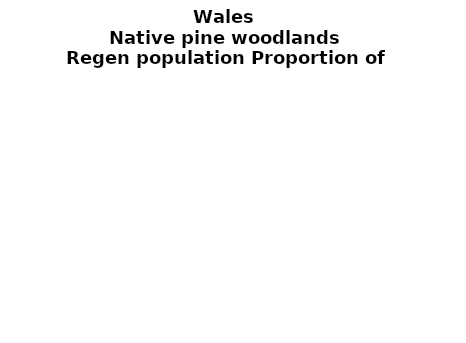
| Category | Native pine woodlands |
|---|---|
| None | 0 |
| Seedlings only | 0 |
| Seedlings, saplings only | 0 |
| Seedlings, saplings, <7 cm trees | 0 |
| Saplings only | 0 |
| <7 cm trees, seedlings only | 0 |
| <7 cm trees, saplings only | 0 |
| <7 cm Trees only | 0 |